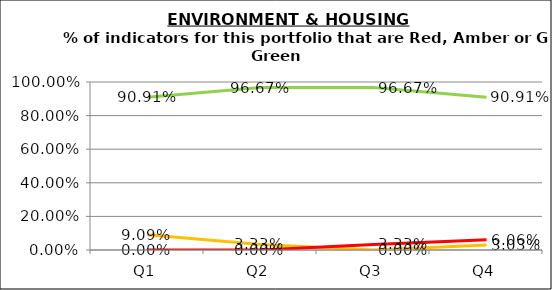
| Category | Green | Amber | Red |
|---|---|---|---|
| Q1 | 0.909 | 0.091 | 0 |
| Q2 | 0.967 | 0.033 | 0 |
| Q3 | 0.967 | 0 | 0.033 |
| Q4 | 0.909 | 0.03 | 0.061 |